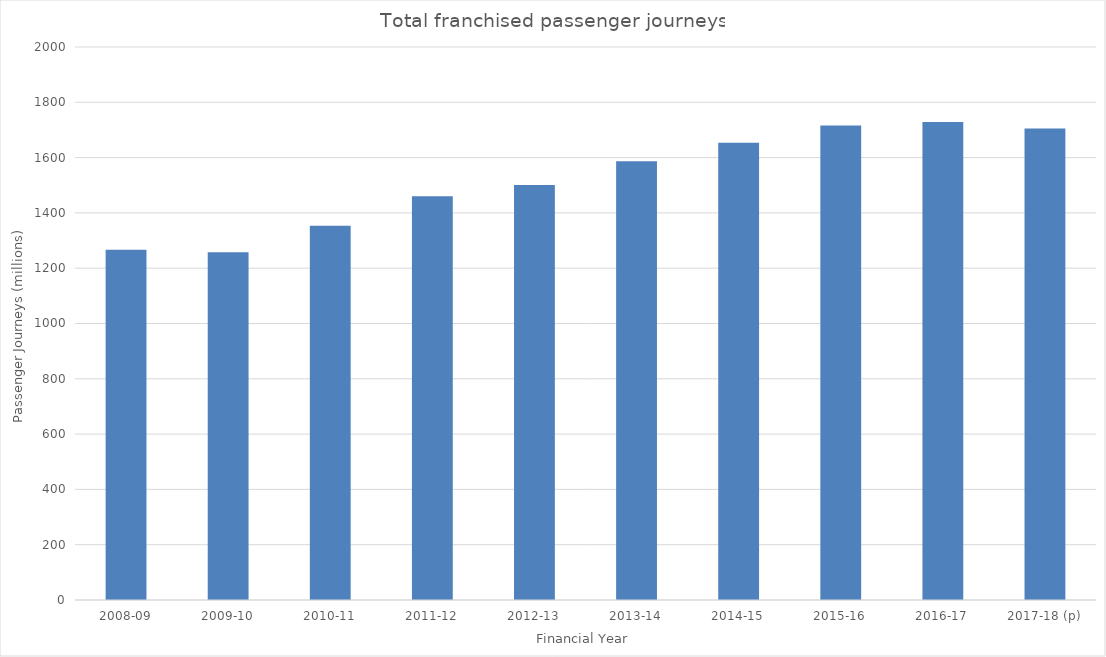
| Category | Total franchised passenger journeys |
|---|---|
| 2008-09 | 1266.479 |
| 2009-10 | 1257.872 |
| 2010-11 | 1353.777 |
| 2011-12 | 1459.984 |
| 2012-13 | 1500.934 |
| 2013-14 | 1586.453 |
| 2014-15 | 1653.718 |
| 2015-16 | 1715.879 |
| 2016-17 | 1729.057 |
| 2017-18 (p) | 1705.494 |